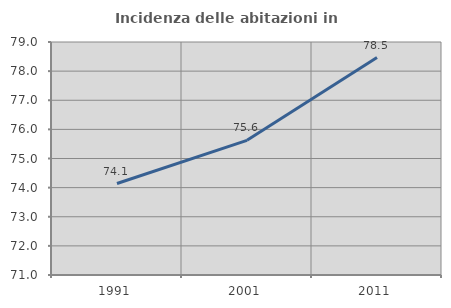
| Category | Incidenza delle abitazioni in proprietà  |
|---|---|
| 1991.0 | 74.141 |
| 2001.0 | 75.624 |
| 2011.0 | 78.468 |